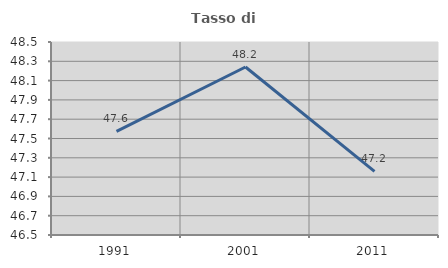
| Category | Tasso di occupazione   |
|---|---|
| 1991.0 | 47.574 |
| 2001.0 | 48.241 |
| 2011.0 | 47.16 |